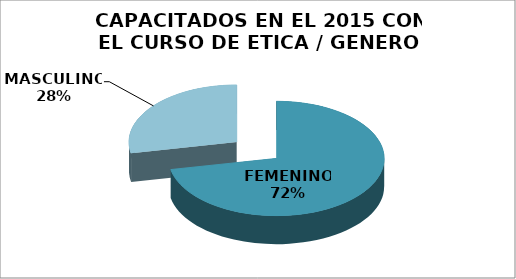
| Category | Series 0 |
|---|---|
| FEMENINO  | 69 |
| MASCULINO  | 27 |